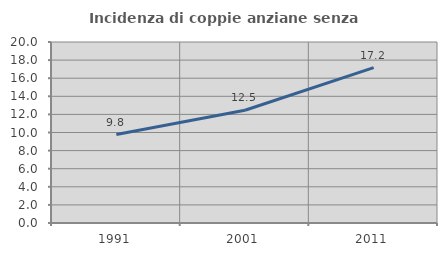
| Category | Incidenza di coppie anziane senza figli  |
|---|---|
| 1991.0 | 9.772 |
| 2001.0 | 12.459 |
| 2011.0 | 17.169 |